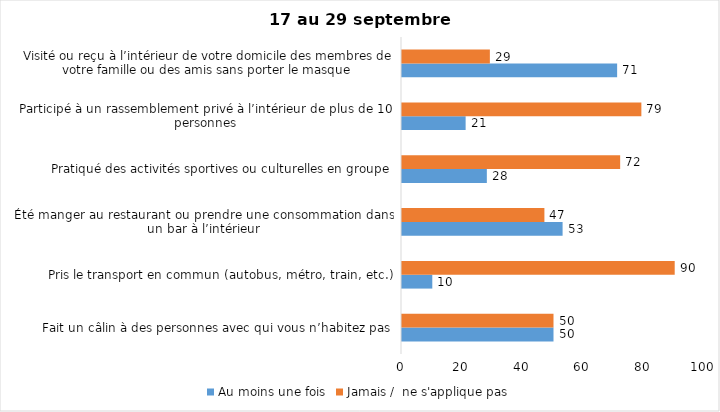
| Category | Au moins une fois | Jamais /  ne s'applique pas |
|---|---|---|
| Fait un câlin à des personnes avec qui vous n’habitez pas | 50 | 50 |
| Pris le transport en commun (autobus, métro, train, etc.) | 10 | 90 |
| Été manger au restaurant ou prendre une consommation dans un bar à l’intérieur | 53 | 47 |
| Pratiqué des activités sportives ou culturelles en groupe | 28 | 72 |
| Participé à un rassemblement privé à l’intérieur de plus de 10 personnes | 21 | 79 |
| Visité ou reçu à l’intérieur de votre domicile des membres de votre famille ou des amis sans porter le masque | 71 | 29 |